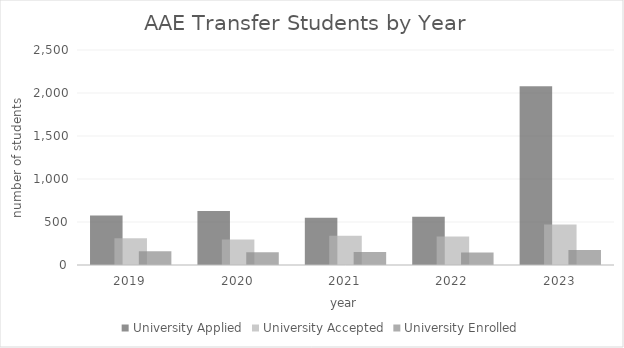
| Category | University |
|---|---|
| 2019.0 | 159 |
| 2020.0 | 149 |
| 2021.0 | 151 |
| 2022.0 | 144 |
| 2023.0 | 173 |